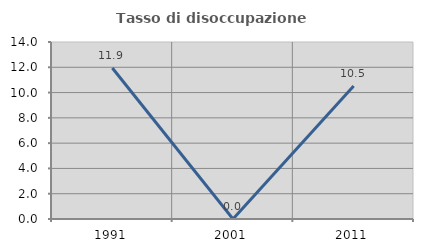
| Category | Tasso di disoccupazione giovanile  |
|---|---|
| 1991.0 | 11.94 |
| 2001.0 | 0 |
| 2011.0 | 10.526 |